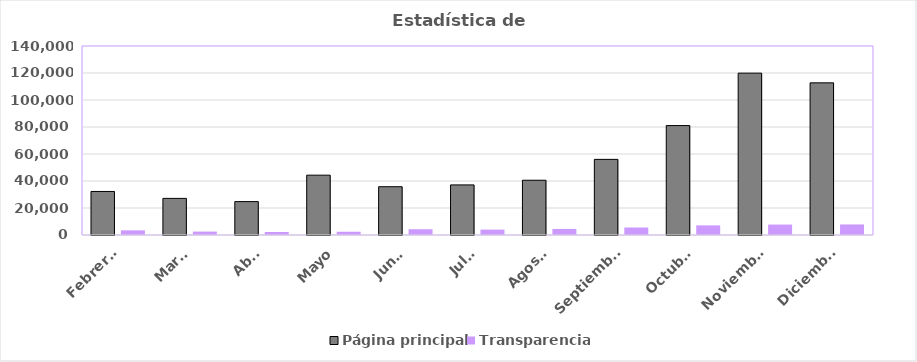
| Category | Página principal | Transparencia |
|---|---|---|
| Febrero  | 32250 | 3433 |
| Marzo | 27119 | 2525 |
| Abril | 24737 | 2232 |
| Mayo | 44324 | 2413 |
| Junio | 35770 | 4269 |
| Julio | 37107 | 4004 |
| Agosto | 40557 | 4483 |
| Septiembre | 56028 | 5546 |
| Octubre | 81064 | 7132 |
| Noviembre | 119885 | 7719 |
| Diciembre | 112701 | 7811 |